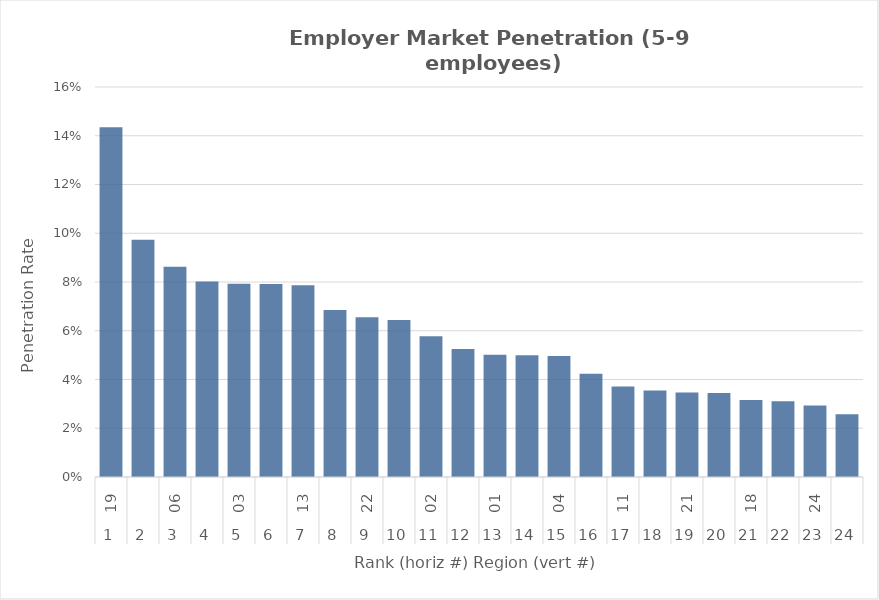
| Category | Rate |
|---|---|
| 0 | 0.143 |
| 1 | 0.097 |
| 2 | 0.086 |
| 3 | 0.08 |
| 4 | 0.079 |
| 5 | 0.079 |
| 6 | 0.079 |
| 7 | 0.069 |
| 8 | 0.066 |
| 9 | 0.064 |
| 10 | 0.058 |
| 11 | 0.052 |
| 12 | 0.05 |
| 13 | 0.05 |
| 14 | 0.05 |
| 15 | 0.042 |
| 16 | 0.037 |
| 17 | 0.036 |
| 18 | 0.035 |
| 19 | 0.034 |
| 20 | 0.032 |
| 21 | 0.031 |
| 22 | 0.029 |
| 23 | 0.026 |